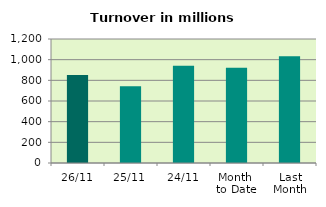
| Category | Series 0 |
|---|---|
| 26/11 | 851.328 |
| 25/11 | 743.357 |
| 24/11 | 940.403 |
| Month 
to Date | 922.809 |
| Last
Month | 1032.218 |